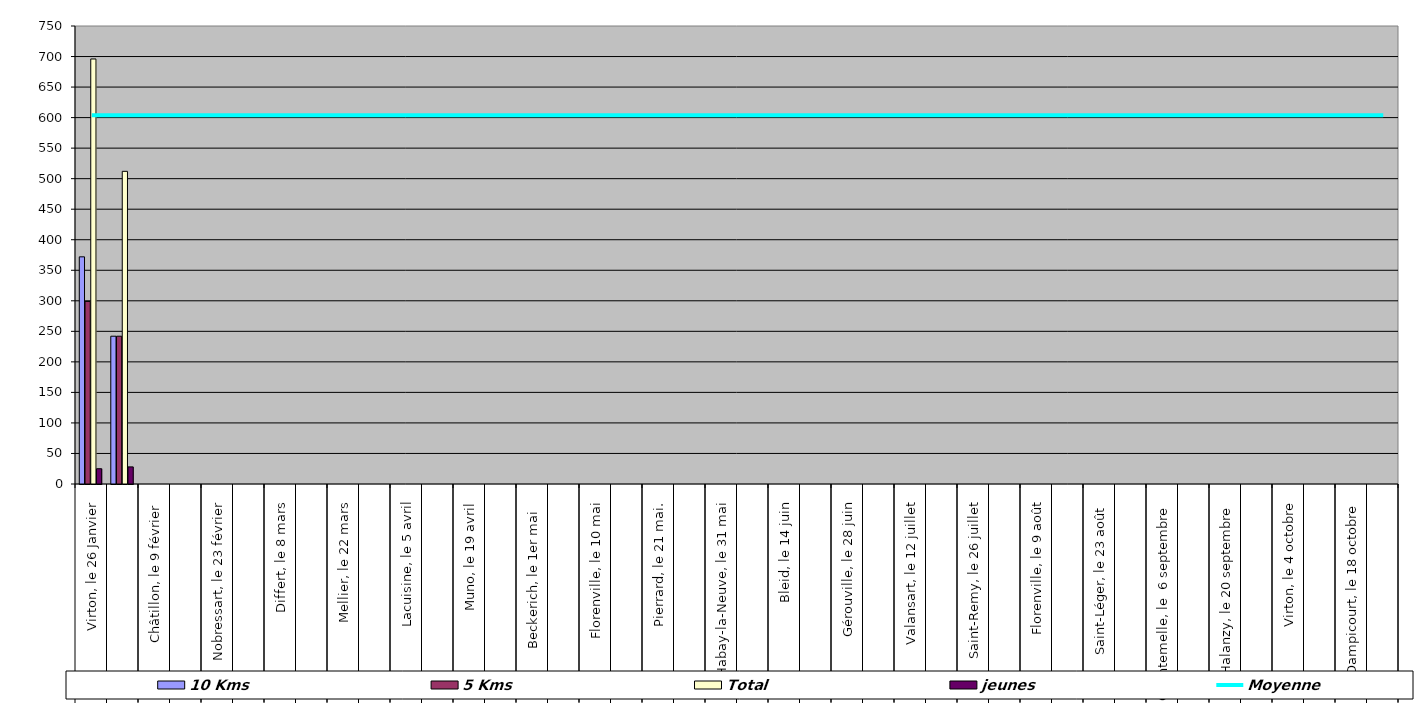
| Category | 10 Kms | 5 Kms | Total | jeunes |
|---|---|---|---|---|
| 0 | 372 | 299 | 696 | 25 |
| 1 | 242 | 242 | 512 | 28 |
| 2 | 0 | 0 | 0 | 0 |
| 3 | 0 | 0 | 0 | 0 |
| 4 | 0 | 0 | 0 | 0 |
| 5 | 0 | 0 | 0 | 0 |
| 6 | 0 | 0 | 0 | 0 |
| 7 | 0 | 0 | 0 | 0 |
| 8 | 0 | 0 | 0 | 0 |
| 9 | 0 | 0 | 0 | 0 |
| 10 | 0 | 0 | 0 | 0 |
| 11 | 0 | 0 | 0 | 0 |
| 12 | 0 | 0 | 0 | 0 |
| 13 | 0 | 0 | 0 | 0 |
| 14 | 0 | 0 | 0 | 0 |
| 15 | 0 | 0 | 0 | 0 |
| 16 | 0 | 0 | 0 | 0 |
| 17 | 0 | 0 | 0 | 0 |
| 18 | 0 | 0 | 0 | 0 |
| 19 | 0 | 0 | 0 | 0 |
| 20 | 0 | 0 | 0 | 0 |
| 21 | 0 | 0 | 0 | 0 |
| 22 | 0 | 0 | 0 | 0 |
| 23 | 0 | 0 | 0 | 0 |
| 24 | 0 | 0 | 0 | 0 |
| 25 | 0 | 0 | 0 | 0 |
| 26 | 0 | 0 | 0 | 0 |
| 27 | 0 | 0 | 0 | 0 |
| 28 | 0 | 0 | 0 | 0 |
| 29 | 0 | 0 | 0 | 0 |
| 30 | 0 | 0 | 0 | 0 |
| 31 | 0 | 0 | 0 | 0 |
| 32 | 0 | 0 | 0 | 0 |
| 33 | 0 | 0 | 0 | 0 |
| 34 | 0 | 0 | 0 | 0 |
| 35 | 0 | 0 | 0 | 0 |
| 36 | 0 | 0 | 0 | 0 |
| 37 | 0 | 0 | 0 | 0 |
| 38 | 0 | 0 | 0 | 0 |
| 39 | 0 | 0 | 0 | 0 |
| 40 | 0 | 0 | 0 | 0 |
| 41 | 0 | 0 | 0 | 0 |